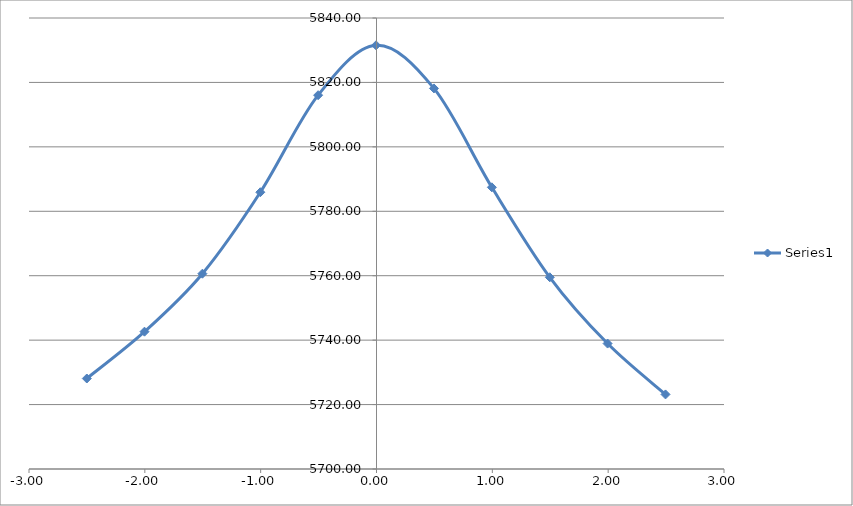
| Category | Series 0 |
|---|---|
| -2.5010000000000003 | 5728.093 |
| -2.003 | 5742.626 |
| -1.5030000000000001 | 5760.628 |
| -1.0030000000000001 | 5785.912 |
| -0.5040000000000004 | 5816.038 |
| -0.004000000000000448 | 5831.528 |
| 0.49599999999999955 | 5818.14 |
| 0.9959999999999996 | 5787.44 |
| 1.4959999999999996 | 5759.517 |
| 1.995 | 5738.942 |
| 2.495 | 5723.149 |